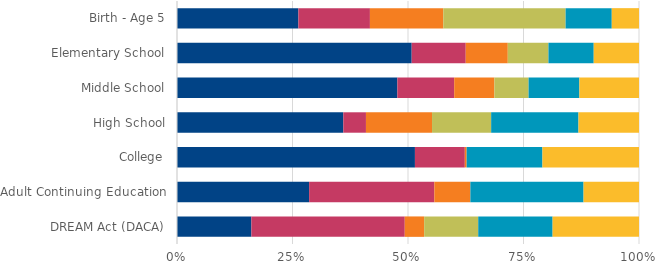
| Category | Schools | Social Services2 | Government/Civic | Health clinics & professional | Community | Don't Know |
|---|---|---|---|---|---|---|
| DREAM Act (DACA) | 16.1 | 33.2 | 4.2 | 11.7 | 16.1 | 18.7 |
| Adult Continuing Education | 28.6 | 27.1 | 7.8 | 0 | 24.5 | 12 |
| College | 51.5 | 10.8 | 0.4 | 0 | 16.4 | 20.9 |
| High School | 36 | 4.9 | 14.3 | 12.8 | 18.9 | 13.1 |
| Middle School | 47.7 | 12.3 | 8.7 | 7.4 | 11 | 12.9 |
| Elementary School | 50.8 | 11.7 | 9.1 | 8.8 | 9.8 | 9.8 |
| Birth - Age 5 | 26.3 | 15.5 | 15.9 | 26.5 | 10 | 5.9 |